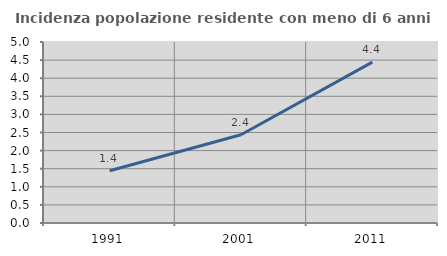
| Category | Incidenza popolazione residente con meno di 6 anni |
|---|---|
| 1991.0 | 1.442 |
| 2001.0 | 2.439 |
| 2011.0 | 4.444 |